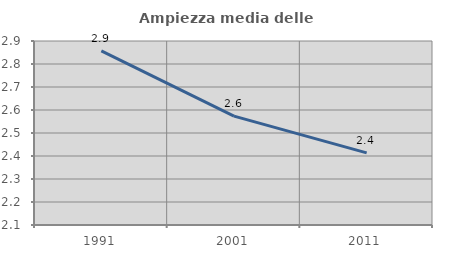
| Category | Ampiezza media delle famiglie |
|---|---|
| 1991.0 | 2.857 |
| 2001.0 | 2.573 |
| 2011.0 | 2.414 |